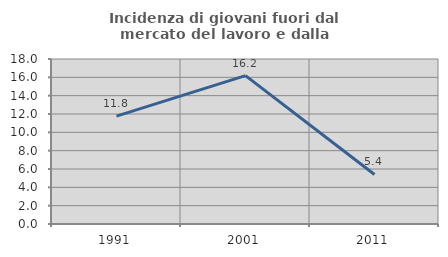
| Category | Incidenza di giovani fuori dal mercato del lavoro e dalla formazione  |
|---|---|
| 1991.0 | 11.765 |
| 2001.0 | 16.19 |
| 2011.0 | 5.405 |